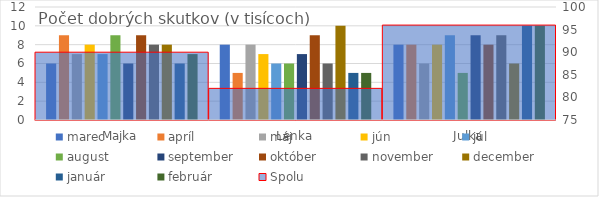
| Category | marec | apríl | máj | jún | júl | august | september | október | november | december | január | február |
|---|---|---|---|---|---|---|---|---|---|---|---|---|
| Majka | 6 | 9 | 7 | 8 | 7 | 9 | 6 | 9 | 8 | 8 | 6 | 7 |
| Lenka | 8 | 5 | 8 | 7 | 6 | 6 | 7 | 9 | 6 | 10 | 5 | 5 |
| Julka | 8 | 8 | 6 | 8 | 9 | 5 | 9 | 8 | 9 | 6 | 10 | 10 |